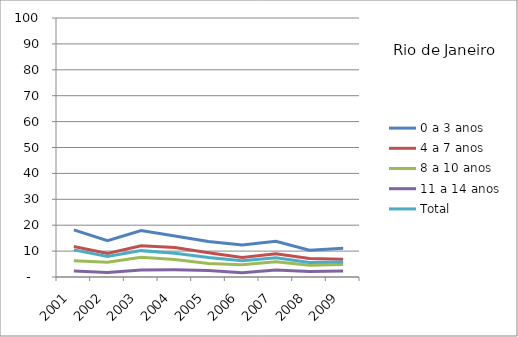
| Category | 0 a 3 anos | 4 a 7 anos | 8 a 10 anos | 11 a 14 anos | Total |
|---|---|---|---|---|---|
| 2001.0 | 18.21 | 11.81 | 6.3 | 2.28 | 10.48 |
| 2002.0 | 14 | 9.11 | 5.66 | 1.71 | 7.93 |
| 2003.0 | 17.91 | 12.05 | 7.64 | 2.73 | 10.18 |
| 2004.0 | 15.86 | 11.39 | 6.74 | 2.77 | 9.21 |
| 2005.0 | 13.74 | 9.34 | 5.2 | 2.54 | 7.55 |
| 2006.0 | 12.34 | 7.51 | 4.77 | 1.61 | 6.26 |
| 2007.0 | 13.76 | 8.98 | 5.89 | 2.7 | 7.44 |
| 2008.0 | 10.37 | 7.12 | 4.54 | 2.08 | 5.61 |
| 2009.0 | 11.06 | 6.82 | 4.82 | 2.33 | 5.82 |